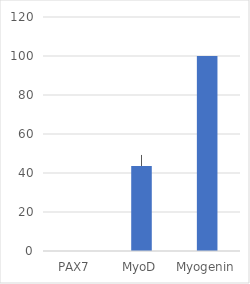
| Category | Mean |
|---|---|
| PAX7 | 0 |
| MyoD | 43.56 |
| Myogenin | 100 |